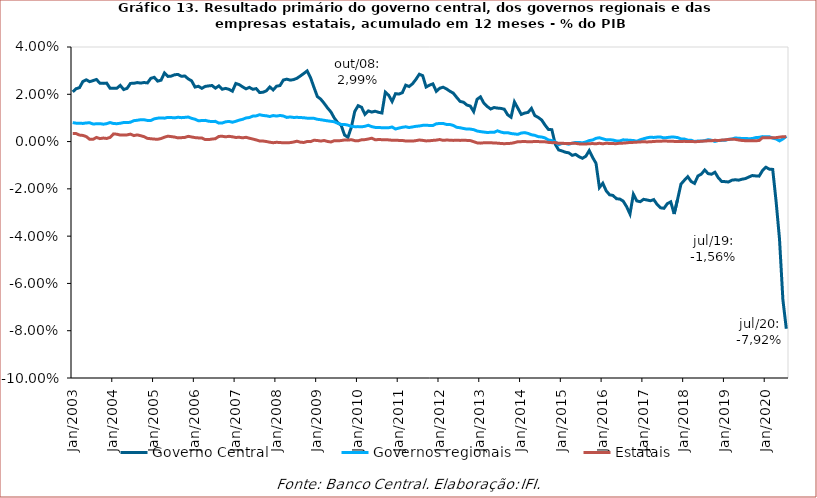
| Category | Governo Central | Governos regionais | Estatais |
|---|---|---|---|
| 2003-01-01 | 0.021 | 0.008 | 0.003 |
| 2003-02-01 | 0.022 | 0.008 | 0.003 |
| 2003-03-01 | 0.023 | 0.008 | 0.003 |
| 2003-04-01 | 0.025 | 0.008 | 0.003 |
| 2003-05-01 | 0.026 | 0.008 | 0.002 |
| 2003-06-01 | 0.025 | 0.008 | 0.001 |
| 2003-07-01 | 0.026 | 0.007 | 0.001 |
| 2003-08-01 | 0.026 | 0.008 | 0.002 |
| 2003-09-01 | 0.025 | 0.008 | 0.001 |
| 2003-10-01 | 0.025 | 0.007 | 0.001 |
| 2003-11-01 | 0.025 | 0.008 | 0.001 |
| 2003-12-01 | 0.023 | 0.008 | 0.002 |
| 2004-01-01 | 0.023 | 0.008 | 0.003 |
| 2004-02-01 | 0.023 | 0.008 | 0.003 |
| 2004-03-01 | 0.024 | 0.008 | 0.003 |
| 2004-04-01 | 0.022 | 0.008 | 0.003 |
| 2004-05-01 | 0.023 | 0.008 | 0.003 |
| 2004-06-01 | 0.025 | 0.008 | 0.003 |
| 2004-07-01 | 0.025 | 0.009 | 0.003 |
| 2004-08-01 | 0.025 | 0.009 | 0.003 |
| 2004-09-01 | 0.025 | 0.009 | 0.002 |
| 2004-10-01 | 0.025 | 0.009 | 0.002 |
| 2004-11-01 | 0.025 | 0.009 | 0.001 |
| 2004-12-01 | 0.027 | 0.009 | 0.001 |
| 2005-01-01 | 0.027 | 0.01 | 0.001 |
| 2005-02-01 | 0.026 | 0.01 | 0.001 |
| 2005-03-01 | 0.026 | 0.01 | 0.001 |
| 2005-04-01 | 0.029 | 0.01 | 0.002 |
| 2005-05-01 | 0.028 | 0.01 | 0.002 |
| 2005-06-01 | 0.028 | 0.01 | 0.002 |
| 2005-07-01 | 0.028 | 0.01 | 0.002 |
| 2005-08-01 | 0.028 | 0.01 | 0.002 |
| 2005-09-01 | 0.028 | 0.01 | 0.002 |
| 2005-10-01 | 0.028 | 0.01 | 0.002 |
| 2005-11-01 | 0.027 | 0.01 | 0.002 |
| 2005-12-01 | 0.026 | 0.01 | 0.002 |
| 2006-01-01 | 0.023 | 0.009 | 0.002 |
| 2006-02-01 | 0.023 | 0.009 | 0.002 |
| 2006-03-01 | 0.023 | 0.009 | 0.002 |
| 2006-04-01 | 0.023 | 0.009 | 0.001 |
| 2006-05-01 | 0.024 | 0.009 | 0.001 |
| 2006-06-01 | 0.024 | 0.008 | 0.001 |
| 2006-07-01 | 0.023 | 0.009 | 0.001 |
| 2006-08-01 | 0.024 | 0.008 | 0.002 |
| 2006-09-01 | 0.022 | 0.008 | 0.002 |
| 2006-10-01 | 0.023 | 0.008 | 0.002 |
| 2006-11-01 | 0.022 | 0.009 | 0.002 |
| 2006-12-01 | 0.021 | 0.008 | 0.002 |
| 2007-01-01 | 0.025 | 0.009 | 0.002 |
| 2007-02-01 | 0.024 | 0.009 | 0.002 |
| 2007-03-01 | 0.023 | 0.009 | 0.002 |
| 2007-04-01 | 0.022 | 0.01 | 0.002 |
| 2007-05-01 | 0.023 | 0.01 | 0.001 |
| 2007-06-01 | 0.022 | 0.011 | 0.001 |
| 2007-07-01 | 0.022 | 0.011 | 0.001 |
| 2007-08-01 | 0.021 | 0.011 | 0 |
| 2007-09-01 | 0.021 | 0.011 | 0 |
| 2007-10-01 | 0.021 | 0.011 | 0 |
| 2007-11-01 | 0.023 | 0.011 | 0 |
| 2007-12-01 | 0.022 | 0.011 | 0 |
| 2008-01-01 | 0.023 | 0.011 | 0 |
| 2008-02-01 | 0.024 | 0.011 | 0 |
| 2008-03-01 | 0.026 | 0.011 | -0.001 |
| 2008-04-01 | 0.026 | 0.01 | -0.001 |
| 2008-05-01 | 0.026 | 0.01 | 0 |
| 2008-06-01 | 0.026 | 0.01 | 0 |
| 2008-07-01 | 0.027 | 0.01 | 0 |
| 2008-08-01 | 0.028 | 0.01 | 0 |
| 2008-09-01 | 0.029 | 0.01 | 0 |
| 2008-10-01 | 0.03 | 0.01 | 0 |
| 2008-11-01 | 0.027 | 0.01 | 0 |
| 2008-12-01 | 0.023 | 0.01 | 0.001 |
| 2009-01-01 | 0.019 | 0.009 | 0 |
| 2009-02-01 | 0.018 | 0.009 | 0 |
| 2009-03-01 | 0.016 | 0.009 | 0 |
| 2009-04-01 | 0.014 | 0.009 | 0 |
| 2009-05-01 | 0.013 | 0.009 | 0 |
| 2009-06-01 | 0.01 | 0.008 | 0 |
| 2009-07-01 | 0.008 | 0.008 | 0 |
| 2009-08-01 | 0.007 | 0.007 | 0 |
| 2009-09-01 | 0.003 | 0.007 | 0.001 |
| 2009-10-01 | 0.002 | 0.007 | 0.001 |
| 2009-11-01 | 0.006 | 0.006 | 0.001 |
| 2009-12-01 | 0.013 | 0.006 | 0 |
| 2010-01-01 | 0.015 | 0.006 | 0 |
| 2010-02-01 | 0.015 | 0.006 | 0.001 |
| 2010-03-01 | 0.012 | 0.006 | 0.001 |
| 2010-04-01 | 0.013 | 0.007 | 0.001 |
| 2010-05-01 | 0.012 | 0.006 | 0.001 |
| 2010-06-01 | 0.013 | 0.006 | 0.001 |
| 2010-07-01 | 0.012 | 0.006 | 0.001 |
| 2010-08-01 | 0.012 | 0.006 | 0.001 |
| 2010-09-01 | 0.021 | 0.006 | 0.001 |
| 2010-10-01 | 0.02 | 0.006 | 0.001 |
| 2010-11-01 | 0.017 | 0.006 | 0.001 |
| 2010-12-01 | 0.02 | 0.005 | 0.001 |
| 2011-01-01 | 0.02 | 0.006 | 0 |
| 2011-02-01 | 0.021 | 0.006 | 0 |
| 2011-03-01 | 0.024 | 0.006 | 0 |
| 2011-04-01 | 0.023 | 0.006 | 0 |
| 2011-05-01 | 0.024 | 0.006 | 0 |
| 2011-06-01 | 0.026 | 0.006 | 0 |
| 2011-07-01 | 0.028 | 0.007 | 0.001 |
| 2011-08-01 | 0.028 | 0.007 | 0.001 |
| 2011-09-01 | 0.023 | 0.007 | 0 |
| 2011-10-01 | 0.024 | 0.007 | 0 |
| 2011-11-01 | 0.024 | 0.007 | 0 |
| 2011-12-01 | 0.021 | 0.008 | 0.001 |
| 2012-01-01 | 0.023 | 0.008 | 0.001 |
| 2012-02-01 | 0.023 | 0.008 | 0.001 |
| 2012-03-01 | 0.022 | 0.007 | 0.001 |
| 2012-04-01 | 0.021 | 0.007 | 0.001 |
| 2012-05-01 | 0.02 | 0.007 | 0 |
| 2012-06-01 | 0.019 | 0.006 | 0.001 |
| 2012-07-01 | 0.017 | 0.006 | 0 |
| 2012-08-01 | 0.017 | 0.006 | 0.001 |
| 2012-09-01 | 0.015 | 0.005 | 0 |
| 2012-10-01 | 0.015 | 0.005 | 0 |
| 2012-11-01 | 0.013 | 0.005 | 0 |
| 2012-12-01 | 0.018 | 0.004 | -0.001 |
| 2013-01-01 | 0.019 | 0.004 | -0.001 |
| 2013-02-01 | 0.016 | 0.004 | -0.001 |
| 2013-03-01 | 0.015 | 0.004 | 0 |
| 2013-04-01 | 0.014 | 0.004 | 0 |
| 2013-05-01 | 0.014 | 0.004 | -0.001 |
| 2013-06-01 | 0.014 | 0.005 | -0.001 |
| 2013-07-01 | 0.014 | 0.004 | -0.001 |
| 2013-08-01 | 0.014 | 0.004 | -0.001 |
| 2013-09-01 | 0.011 | 0.004 | -0.001 |
| 2013-10-01 | 0.01 | 0.003 | -0.001 |
| 2013-11-01 | 0.017 | 0.003 | 0 |
| 2013-12-01 | 0.014 | 0.003 | 0 |
| 2014-01-01 | 0.011 | 0.004 | 0 |
| 2014-02-01 | 0.012 | 0.004 | 0 |
| 2014-03-01 | 0.012 | 0.003 | 0 |
| 2014-04-01 | 0.014 | 0.003 | 0 |
| 2014-05-01 | 0.011 | 0.003 | 0 |
| 2014-06-01 | 0.01 | 0.002 | 0 |
| 2014-07-01 | 0.009 | 0.002 | 0 |
| 2014-08-01 | 0.007 | 0.002 | 0 |
| 2014-09-01 | 0.005 | 0.001 | 0 |
| 2014-10-01 | 0.005 | 0 | 0 |
| 2014-11-01 | -0.001 | 0 | 0 |
| 2014-12-01 | -0.004 | -0.001 | -0.001 |
| 2015-01-01 | -0.004 | -0.001 | -0.001 |
| 2015-02-01 | -0.005 | -0.001 | -0.001 |
| 2015-03-01 | -0.005 | -0.001 | -0.001 |
| 2015-04-01 | -0.006 | -0.001 | -0.001 |
| 2015-05-01 | -0.005 | 0 | -0.001 |
| 2015-06-01 | -0.006 | 0 | -0.001 |
| 2015-07-01 | -0.007 | -0.001 | -0.001 |
| 2015-08-01 | -0.006 | 0 | -0.001 |
| 2015-09-01 | -0.004 | 0 | -0.001 |
| 2015-10-01 | -0.007 | 0.001 | -0.001 |
| 2015-11-01 | -0.009 | 0.001 | -0.001 |
| 2015-12-01 | -0.019 | 0.002 | -0.001 |
| 2016-01-01 | -0.018 | 0.001 | -0.001 |
| 2016-02-01 | -0.021 | 0.001 | -0.001 |
| 2016-03-01 | -0.023 | 0.001 | -0.001 |
| 2016-04-01 | -0.023 | 0.001 | -0.001 |
| 2016-05-01 | -0.024 | 0 | -0.001 |
| 2016-06-01 | -0.024 | 0 | -0.001 |
| 2016-07-01 | -0.025 | 0.001 | -0.001 |
| 2016-08-01 | -0.028 | 0.001 | -0.001 |
| 2016-09-01 | -0.031 | 0.001 | 0 |
| 2016-10-01 | -0.022 | 0 | 0 |
| 2016-11-01 | -0.025 | 0 | 0 |
| 2016-12-01 | -0.025 | 0.001 | 0 |
| 2017-01-01 | -0.024 | 0.001 | 0 |
| 2017-02-01 | -0.025 | 0.002 | 0 |
| 2017-03-01 | -0.025 | 0.002 | 0 |
| 2017-04-01 | -0.025 | 0.002 | 0 |
| 2017-05-01 | -0.027 | 0.002 | 0 |
| 2017-06-01 | -0.028 | 0.002 | 0 |
| 2017-07-01 | -0.028 | 0.002 | 0 |
| 2017-08-01 | -0.026 | 0.002 | 0 |
| 2017-09-01 | -0.025 | 0.002 | 0 |
| 2017-10-01 | -0.031 | 0.002 | 0 |
| 2017-11-01 | -0.024 | 0.002 | 0 |
| 2017-12-01 | -0.018 | 0.001 | 0 |
| 2018-01-01 | -0.016 | 0.001 | 0 |
| 2018-02-01 | -0.015 | 0.001 | 0 |
| 2018-03-01 | -0.017 | 0.001 | 0 |
| 2018-04-01 | -0.018 | 0 | 0 |
| 2018-05-01 | -0.015 | 0 | 0 |
| 2018-06-01 | -0.014 | 0 | 0 |
| 2018-07-01 | -0.012 | 0 | 0 |
| 2018-08-01 | -0.014 | 0.001 | 0 |
| 2018-09-01 | -0.014 | 0.001 | 0 |
| 2018-10-01 | -0.013 | 0 | 0.001 |
| 2018-11-01 | -0.015 | 0 | 0 |
| 2018-12-01 | -0.017 | 0.001 | 0.001 |
| 2019-01-01 | -0.017 | 0.001 | 0.001 |
| 2019-02-01 | -0.017 | 0.001 | 0.001 |
| 2019-03-01 | -0.016 | 0.001 | 0.001 |
| 2019-04-01 | -0.016 | 0.002 | 0.001 |
| 2019-05-01 | -0.016 | 0.001 | 0.001 |
| 2019-06-01 | -0.016 | 0.001 | 0 |
| 2019-07-01 | -0.016 | 0.001 | 0 |
| 2019-08-01 | -0.015 | 0.001 | 0 |
| 2019-09-01 | -0.014 | 0.001 | 0 |
| 2019-10-01 | -0.015 | 0.002 | 0 |
| 2019-11-01 | -0.015 | 0.002 | 0 |
| 2019-12-01 | -0.012 | 0.002 | 0.002 |
| 2020-01-01 | -0.011 | 0.002 | 0.002 |
| 2020-02-01 | -0.012 | 0.002 | 0.002 |
| 2020-03-01 | -0.012 | 0.001 | 0.002 |
| 2020-04-01 | -0.025 | 0.001 | 0.002 |
| 2020-05-01 | -0.041 | 0 | 0.002 |
| 2020-06-01 | -0.067 | 0.001 | 0.002 |
| 2020-07-01 | -0.079 | 0.002 | 0.002 |